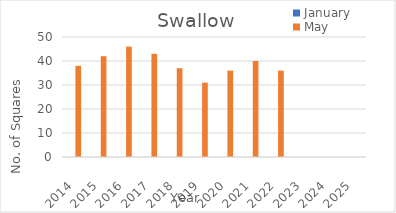
| Category | January | May |
|---|---|---|
| 2014.0 | 0 | 38 |
| 2015.0 | 0 | 42 |
| 2016.0 | 0 | 46 |
| 2017.0 | 0 | 43 |
| 2018.0 | 0 | 37 |
| 2019.0 | 0 | 31 |
| 2020.0 | 0 | 36 |
| 2021.0 | 0 | 40 |
| 2022.0 | 0 | 36 |
| 2023.0 | 0 | 0 |
| 2024.0 | 0 | 0 |
| 2025.0 | 0 | 0 |